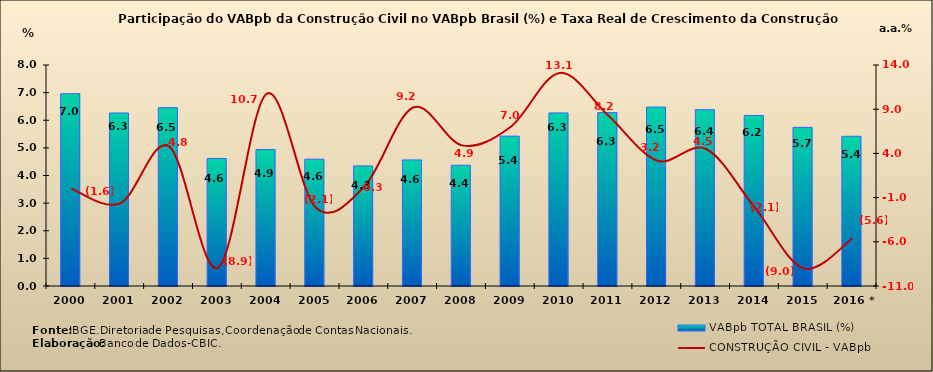
| Category | VABpb TOTAL BRASIL (%) |
|---|---|
| 2000 | 6.96 |
| 2001 | 6.264 |
| 2002 | 6.454 |
| 2003 | 4.615 |
| 2004 | 4.937 |
| 2005 | 4.589 |
| 2006 | 4.348 |
| 2007 | 4.564 |
| 2008 | 4.371 |
| 2009 | 5.426 |
| 2010 | 6.265 |
| 2011 | 6.277 |
| 2012 | 6.478 |
| 2013 | 6.382 |
| 2014 | 6.173 |
| 2015 | 5.742 |
| 2016 * | 5.419 |